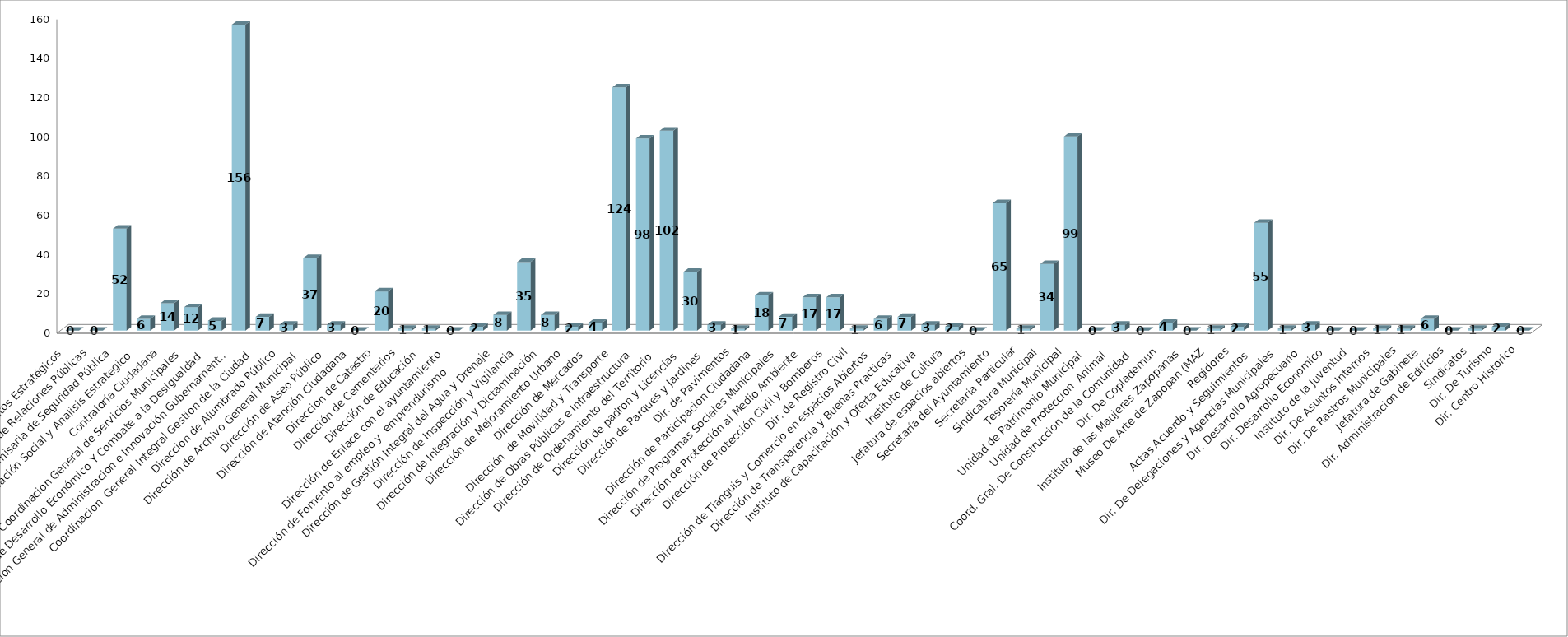
| Category | Series 0 | Series 1 |
|---|---|---|
| Area de Proyectos Estratégicos |  | 0 |
| Área de Relaciones Públicas |  | 0 |
| Comisaria de Seguridad Pública |  | 52 |
| Comunicación Social y Analisis Estrategico  |  | 6 |
| Contraloría Ciudadana |  | 14 |
| Coordinación General de Servicios Municipales |  | 12 |
| Coordinación de Desarrollo Económico Y Combate a la Desigualdad |  | 5 |
| Coordinación General de Administración e Innovación Gubernamental |  | 156 |
| Coordinacion  General Integral Gestion de la Ciudad |  | 7 |
| Dirección de Alumbrado Público |  | 3 |
| Dirección de Archivo General Municipal  |  | 37 |
| Dirección de Aseo Público  |  | 3 |
| Dirección de Atención Ciudadana |  | 0 |
| Dirección de Catastro |  | 20 |
| Dirección de Cementerios |  | 1 |
| Dirección de Educación  |  | 1 |
| Dirección de Enlace con el ayuntamiento |  | 0 |
| Dirección de Fomento al empleo y  emprendurismo         |  | 2 |
| Dirección de Gestión Integral del Agua y Drenaje |  | 8 |
| Dirección de Inspección y Vigilancia |  | 35 |
| Dirección de Integración y Dictaminación |  | 8 |
| Dirección de Mejoramiento Urbano |  | 2 |
| Dirección de Mercados  |  | 4 |
| Dirección  de Movilidad y Transporte |  | 124 |
| Dirección de Obras Públicas e Infraestructura |  | 98 |
| Dirección de Ordenamiento del Territorio  |  | 102 |
| Dirección de padrón y Licencias  |  | 30 |
| Dirección de Parques y Jardines  |  | 3 |
| Dir. de Pavimentos |  | 1 |
| Dirección de Participación Ciudadana |  | 18 |
| Dirección de Programas Sociales Municipales |  | 7 |
| Dirección de Protección al Medio Ambiente  |  | 17 |
| Dirección de Protección Civil y Bomberos |  | 17 |
| Dir. de Registro Civil |  | 1 |
| Dirección de Tianguis y Comercio en espacios Abiertos |  | 6 |
| Dirección de Transparencia y Buenas Prácticas |  | 7 |
| Instituto de Capacitación y Oferta Educativa |  | 3 |
| Instituto de Cultura  |  | 2 |
| Jefatura de espacios abiertos |  | 0 |
| Secretaría del Ayuntamiento |  | 65 |
| Secretaria Particular |  | 1 |
| Sindicatura Municipal |  | 34 |
| Tesorería Municipal |  | 99 |
| Unidad de Patrimonio Municipal  |  | 0 |
| Unidad de Protección  Animal  |  | 3 |
| Coord. Gral. De Construccion de la Comunidad |  | 0 |
| Dir. De Coplademun |  | 4 |
| Instituto de las Maujeres Zapopanas |  | 0 |
| Museo De Arte de Zapopan (MAZ |  | 1 |
| Regidores |  | 2 |
| Actas Acuerdo y Seguimientos  |  | 55 |
| Dir. De Delegaciones y Agencias Municipales |  | 1 |
|  Dir. Desarrollo Agropecuario |  | 3 |
| Dir. Desarrollo Economico |  | 0 |
| Instituto de la Juventud |  | 0 |
| Dir. De Asuntos Internos |  | 1 |
| Dir. De Rastros Municipales |  | 1 |
| Jefatura de Gabinete |  | 6 |
| Dir. Administracion de Edificios |  | 0 |
| Sindicatos |  | 1 |
| Dir. De Turismo |  | 2 |
| Dir. Centro Historico |  | 0 |